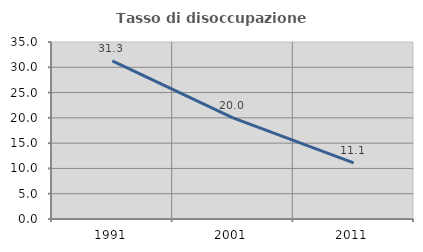
| Category | Tasso di disoccupazione giovanile  |
|---|---|
| 1991.0 | 31.25 |
| 2001.0 | 20 |
| 2011.0 | 11.111 |